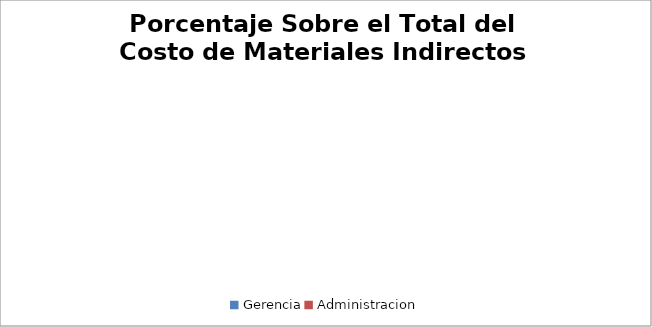
| Category | Porcentaje Sobre el Total del Costo de Materiales Indirectos |
|---|---|
| Gerencia | 0 |
| Administracion | 0 |